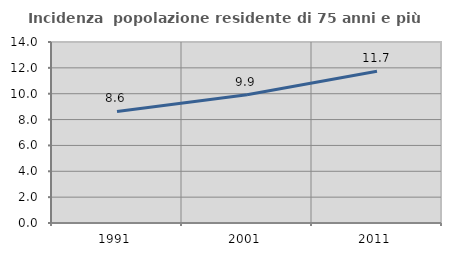
| Category | Incidenza  popolazione residente di 75 anni e più |
|---|---|
| 1991.0 | 8.627 |
| 2001.0 | 9.923 |
| 2011.0 | 11.741 |